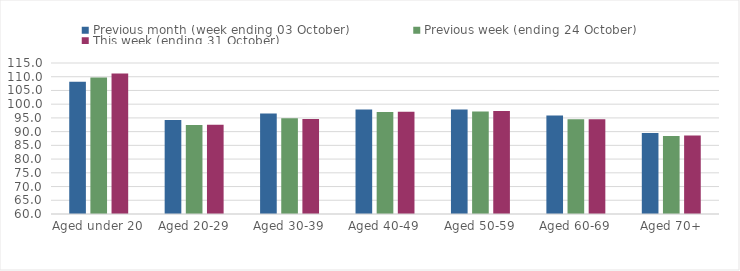
| Category | Previous month (week ending 03 October) | Previous week (ending 24 October) | This week (ending 31 October) |
|---|---|---|---|
| Aged under 20 | 108.16 | 109.74 | 111.19 |
| Aged 20-29 | 94.27 | 92.45 | 92.48 |
| Aged 30-39 | 96.63 | 94.87 | 94.6 |
| Aged 40-49 | 98.08 | 97.13 | 97.21 |
| Aged 50-59 | 98.1 | 97.32 | 97.48 |
| Aged 60-69 | 95.88 | 94.48 | 94.55 |
| Aged 70+ | 89.53 | 88.38 | 88.57 |